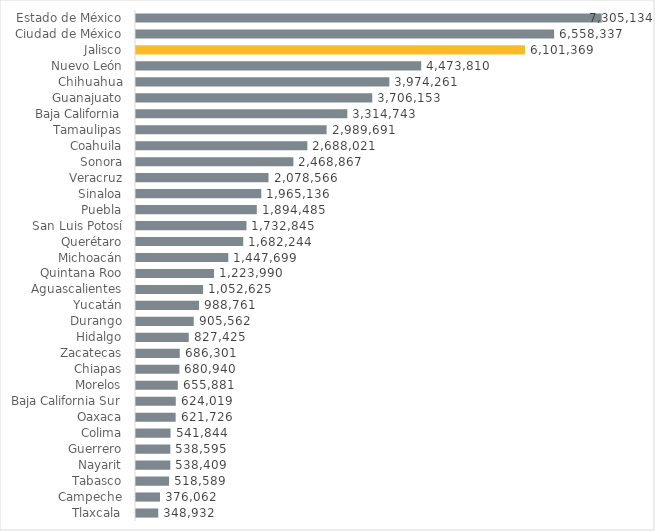
| Category | Series 0 |
|---|---|
| Tlaxcala | 348932 |
| Campeche | 376062 |
| Tabasco | 518589 |
| Nayarit | 538409 |
| Guerrero | 538595 |
| Colima | 541844 |
| Oaxaca | 621726 |
| Baja California Sur | 624019 |
| Morelos | 655881 |
| Chiapas | 680940 |
| Zacatecas | 686301 |
| Hidalgo | 827425 |
| Durango | 905562 |
| Yucatán | 988761 |
| Aguascalientes | 1052625 |
| Quintana Roo | 1223990 |
| Michoacán | 1447699 |
| Querétaro | 1682244 |
| San Luis Potosí | 1732845 |
| Puebla | 1894485 |
| Sinaloa | 1965136 |
| Veracruz | 2078566 |
| Sonora | 2468867 |
| Coahuila | 2688021 |
| Tamaulipas | 2989691 |
| Baja California | 3314743 |
| Guanajuato | 3706153 |
| Chihuahua | 3974261 |
| Nuevo León | 4473810 |
| Jalisco | 6101369 |
| Ciudad de México | 6558337 |
| Estado de México | 7305134 |